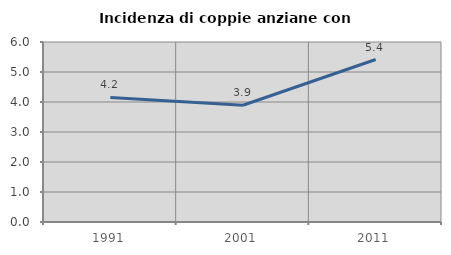
| Category | Incidenza di coppie anziane con figli |
|---|---|
| 1991.0 | 4.151 |
| 2001.0 | 3.891 |
| 2011.0 | 5.417 |